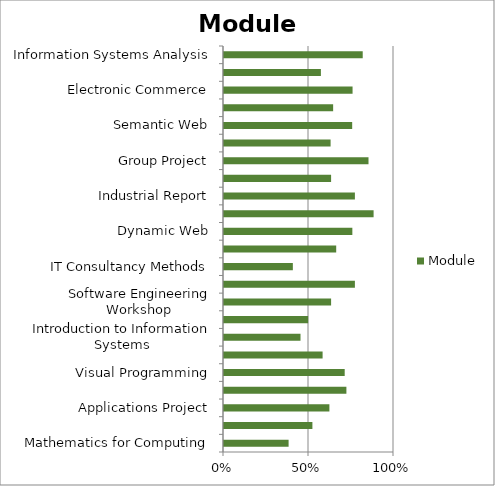
| Category | Module |
|---|---|
| Mathematics for Computing | 0.38 |
| People and Computing | 0.52 |
| Applications Project | 0.62 |
| Computing Concepts and Practice | 0.72 |
| Visual Programming | 0.71 |
| Computer Systems | 0.58 |
| Introduction to Information Systems | 0.45 |
| Networking | 0.495 |
| Software Engineering Workshop | 0.63 |
| Further Object-Oriented Programming | 0.77 |
| IT Consultancy Methods | 0.405 |
| Database Systems | 0.66 |
| Dynamic Web | 0.755 |
| Introduction to Object Orientated Programming | 0.88 |
| Industrial Report | 0.77 |
| Performance Evaluation | 0.63 |
| Group Project | 0.85 |
| Data Mining | 0.627 |
| Semantic Web | 0.754 |
| Computing Law and Professional Responsibility | 0.642 |
| Electronic Commerce | 0.756 |
| Computer Security and Cryptography | 0.57 |
| Information Systems Analysis | 0.816 |